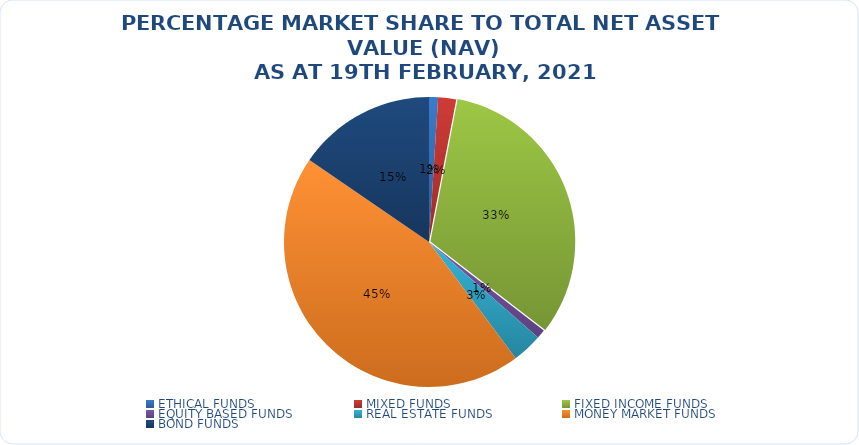
| Category | NET ASSET VALUE |
|---|---|
| ETHICAL FUNDS | 14973964028.36 |
| MIXED FUNDS | 29803042355.01 |
| FIXED INCOME FUNDS | 482304677429.963 |
| EQUITY BASED FUNDS | 14839652118.94 |
| REAL ESTATE FUNDS | 49921436086.431 |
| MONEY MARKET FUNDS | 665301989611.17 |
| BOND FUNDS | 229472480056.97 |